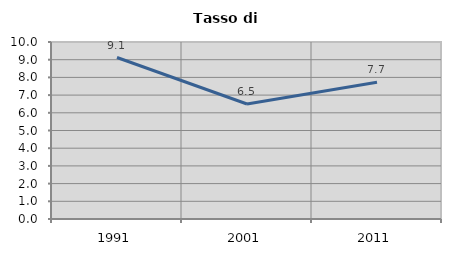
| Category | Tasso di disoccupazione   |
|---|---|
| 1991.0 | 9.123 |
| 2001.0 | 6.496 |
| 2011.0 | 7.727 |